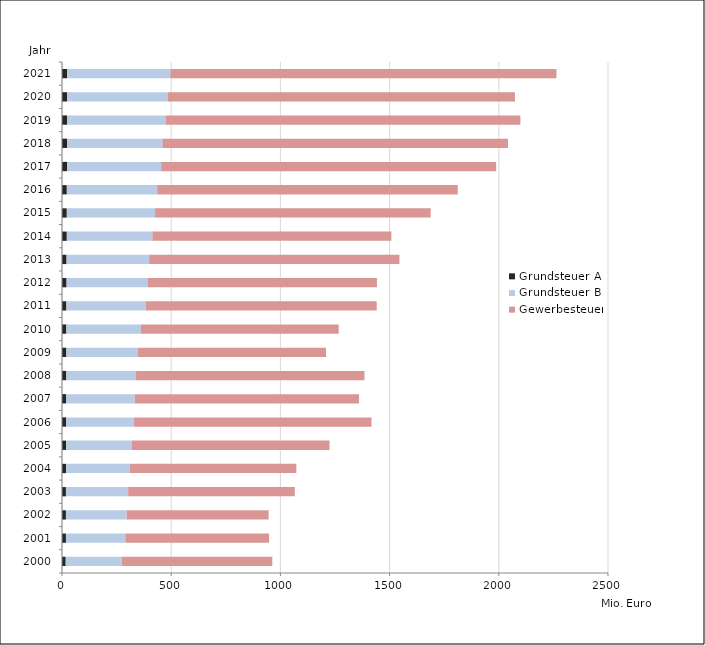
| Category | Grundsteuer A | Grundsteuer B | Gewerbesteuer |
|---|---|---|---|
| 2000.0 | 17 | 257 | 689 |
| 2001.0 | 18 | 272 | 658 |
| 2002.0 | 18 | 278 | 650 |
| 2003.0 | 18 | 285 | 763 |
| 2004.0 | 19 | 292 | 762 |
| 2005.0 | 19 | 301 | 905 |
| 2006.0 | 19 | 311 | 1087 |
| 2007.0 | 19 | 314 | 1027 |
| 2008.0 | 20 | 319 | 1046 |
| 2009.0 | 20 | 328 | 861 |
| 2010.0 | 20 | 341 | 906 |
| 2011.0 | 20 | 364 | 1057 |
| 2012.0 | 21 | 371 | 1050 |
| 2013.0 | 21 | 378 | 1146 |
| 2014.0 | 22 | 392 | 1094 |
| 2015.0 | 22 | 404 | 1262 |
| 2016.0 | 22 | 414 | 1376 |
| 2017.0 | 23 | 431 | 1534 |
| 2018.0 | 23 | 437 | 1582 |
| 2019.0 | 23 | 451 | 1625 |
| 2020.0 | 23 | 460 | 1591 |
| 2021.0 | 23 | 473 | 1768 |